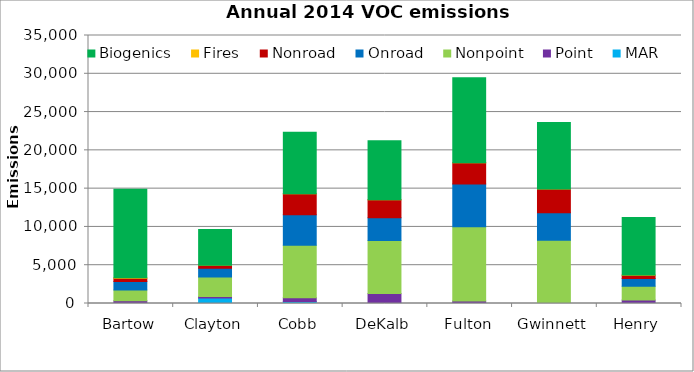
| Category | MAR | Point | Nonpoint | Onroad | Nonroad | Fires | Biogenics |
|---|---|---|---|---|---|---|---|
| Bartow | 22.302 | 335.69 | 1408.377 | 1108.973 | 416.079 | 59.905 | 11553.476 |
| Clayton | 712.634 | 212.86 | 2522.322 | 1167.337 | 376.243 | 2.047 | 4671.192 |
| Cobb | 271.621 | 491.3 | 6834.726 | 4004.691 | 2720.495 | 0.009 | 8039.259 |
| DeKalb | 29.941 | 1276.74 | 6919.858 | 2969.479 | 2355.249 | 6.776 | 7683.701 |
| Fulton | 60.842 | 256.37 | 9708.662 | 5571.366 | 2779.538 | 10.158 | 11106.258 |
| Gwinnett | 18.592 | 79.6 | 8175.143 | 3570.255 | 3107.505 | 0.628 | 8695.095 |
| Henry | 16.501 | 438.93 | 1800.895 | 999.147 | 445.188 | 7.794 | 7527.755 |